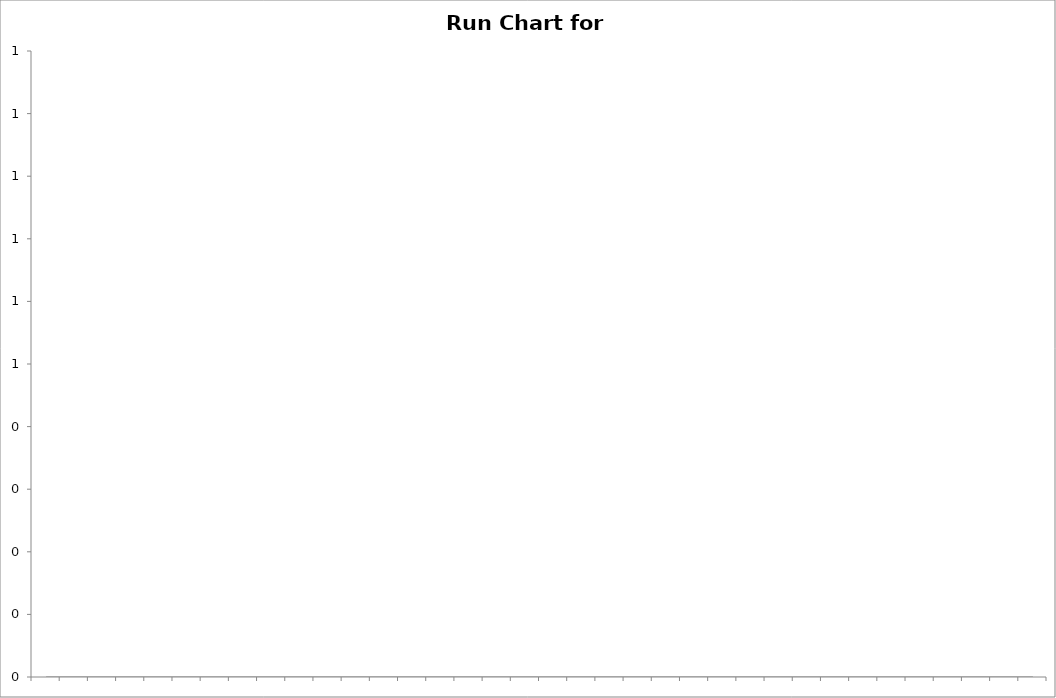
| Category | Median | Measure |
|---|---|---|
|  | 0 |  |
|  | 0 |  |
|  | 0 |  |
|  | 0 |  |
|  | 0 |  |
|  | 0 |  |
|  | 0 |  |
|  | 0 |  |
|  | 0 |  |
|  | 0 |  |
|  | 0 |  |
|  | 0 |  |
|  | 0 |  |
|  | 0 |  |
|  | 0 |  |
|  | 0 |  |
|  | 0 |  |
|  | 0 |  |
|  | 0 |  |
|  | 0 |  |
|  | 0 |  |
|  | 0 |  |
|  | 0 |  |
|  | 0 |  |
|  | 0 |  |
|  | 0 |  |
|  | 0 |  |
|  | 0 |  |
|  | 0 |  |
|  | 0 |  |
|  | 0 |  |
|  | 0 |  |
|  | 0 |  |
|  | 0 |  |
|  | 0 |  |
|  | 0 |  |